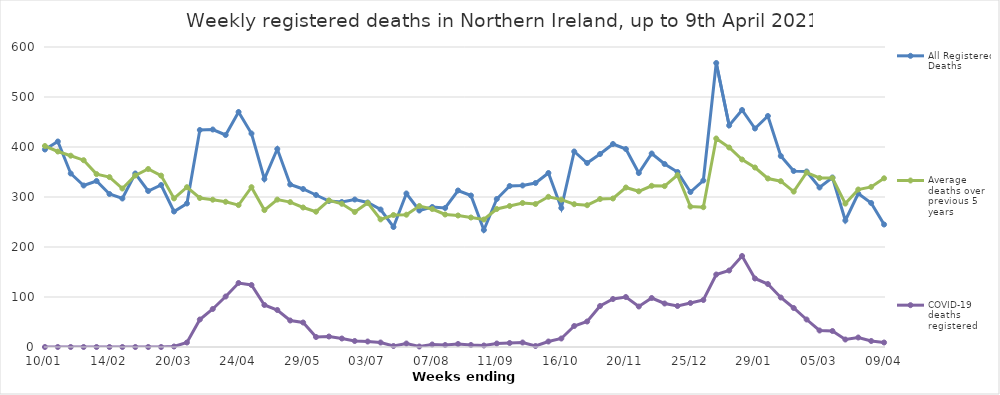
| Category | All Registered Deaths | Average deaths over previous 5 years | COVID-19 deaths registered |
|---|---|---|---|
| 2020-01-10 | 395 | 402 | 0 |
| 2020-01-17 | 411 | 391 | 0 |
| 2020-01-24 | 347 | 382.6 | 0 |
| 2020-01-31 | 323 | 373.6 | 0 |
| 2020-02-07 | 332 | 345.8 | 0 |
| 2020-02-14 | 306 | 339.8 | 0 |
| 2020-02-21 | 297 | 317 | 0 |
| 2020-02-28 | 347 | 343 | 0 |
| 2020-03-06 | 312 | 356 | 0 |
| 2020-03-13 | 324 | 342.8 | 0 |
| 2020-03-20 | 271 | 297.2 | 1 |
| 2020-03-27 | 287 | 319.6 | 9 |
| 2020-04-03 | 434 | 298 | 55 |
| 2020-04-10 | 435 | 294.6 | 76 |
| 2020-04-17 | 424 | 290.4 | 101 |
| 2020-04-24 | 470 | 283.8 | 128 |
| 2020-05-01 | 427 | 319.6 | 124 |
| 2020-05-08 | 336 | 273.8 | 84 |
| 2020-05-15 | 396 | 294.8 | 74 |
| 2020-05-22 | 325 | 289.8 | 53 |
| 2020-05-29 | 316 | 279 | 49 |
| 2020-06-05 | 304 | 270.6 | 20 |
| 2020-06-12 | 292 | 293.2 | 21 |
| 2020-06-19 | 290 | 286.4 | 17 |
| 2020-06-26 | 295 | 270 | 12 |
| 2020-07-03 | 289 | 288.2 | 11 |
| 2020-07-10 | 275 | 255.2 | 9 |
| 2020-07-17 | 240 | 264 | 2 |
| 2020-07-24 | 307 | 264.6 | 7 |
| 2020-07-31 | 273 | 282 | 1 |
| 2020-08-07 | 280 | 276 | 5 |
| 2020-08-14 | 278 | 265 | 4 |
| 2020-08-21 | 313 | 263 | 6 |
| 2020-08-28 | 303 | 259 | 4 |
| 2020-09-04 | 234 | 255 | 3 |
| 2020-09-11 | 296 | 276 | 7 |
| 2020-09-18 | 322 | 282 | 8 |
| 2020-09-25 | 323 | 288 | 9 |
| 2020-10-02 | 328 | 286 | 2 |
| 2020-10-09 | 348 | 300.4 | 11 |
| 2020-10-16 | 278 | 294.8 | 17 |
| 2020-10-23 | 391 | 285.6 | 42 |
| 2020-10-30 | 368 | 283.6 | 51 |
| 2020-11-06 | 386 | 296 | 82 |
| 2020-11-13 | 406 | 297 | 96 |
| 2020-11-20 | 396 | 319 | 100 |
| 2020-11-27 | 348 | 311.4 | 81 |
| 2020-12-04 | 387 | 322.4 | 98 |
| 2020-12-11 | 366 | 321.8 | 87 |
| 2020-12-18 | 350 | 343.8 | 82 |
| 2020-12-25 | 310 | 280.8 | 88 |
| 2021-01-01 | 333 | 279.6 | 94 |
| 2021-01-08 | 568 | 417 | 145 |
| 2021-01-15 | 443 | 399 | 153 |
| 2021-01-22 | 474 | 375 | 182 |
| 2021-01-29 | 437 | 359 | 137 |
| 2021-02-05 | 462 | 337 | 126 |
| 2021-02-12 | 382 | 331.6 | 99 |
| 2021-02-19 | 352 | 310.8 | 78 |
| 2021-02-26 | 351 | 349 | 55 |
| 2021-03-05 | 319 | 338 | 33 |
| 2021-03-12 | 339 | 338 | 32 |
| 2021-03-19 | 253 | 286.8 | 15 |
| 2021-03-26 | 307 | 315 | 19 |
| 2021-04-02 | 288 | 320.2 | 12 |
| 2021-04-09 | 245 | 337.4 | 9 |